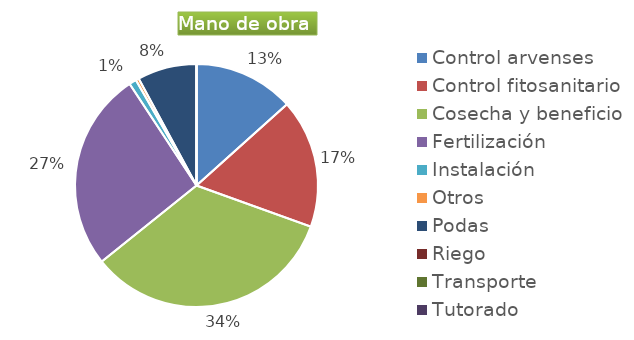
| Category | Series 0 |
|---|---|
| Control arvenses | 15434564 |
| Control fitosanitario | 19809716 |
| Cosecha y beneficio | 38999852.286 |
| Fertilización | 30626064 |
| Instalación | 1108979.5 |
| Otros | 486128 |
| Podas | 9114900 |
| Riego | 0 |
| Transporte | 0 |
| Tutorado | 0 |